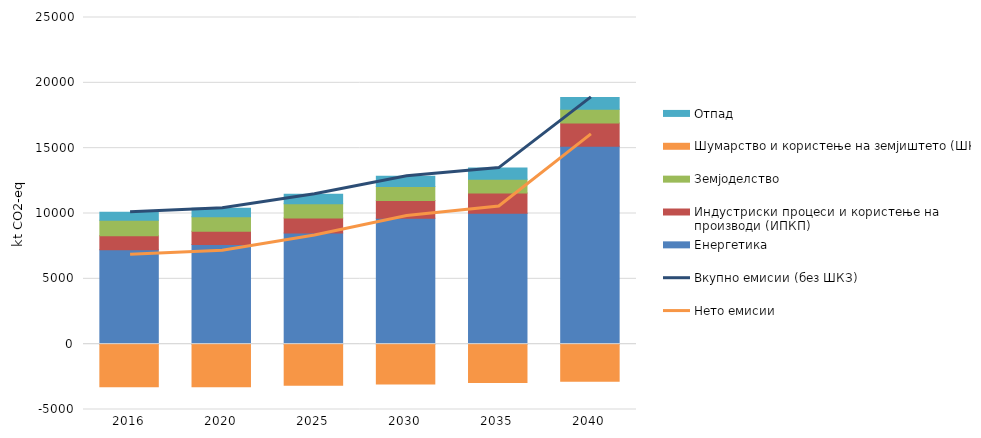
| Category | Енергетика  | Индустриски процеси и користење на производи (ИПКП) | Земјоделство | Шумарство и користење на земјиштето (ШКЗ) | Отпад |
|---|---|---|---|---|---|
| 2016.0 | 7234 | 1056 | 1191 | -3253 | 610 |
| 2020.0 | 7622 | 1024 | 1097 | -3253 | 661 |
| 2025.0 | 8502 | 1163 | 1081 | -3147 | 724 |
| 2030.0 | 9645 | 1352 | 1064 | -3041 | 788 |
| 2035.0 | 10011 | 1562 | 1050 | -2936 | 852 |
| 2040.0 | 15141 | 1792 | 1038 | -2830 | 914 |